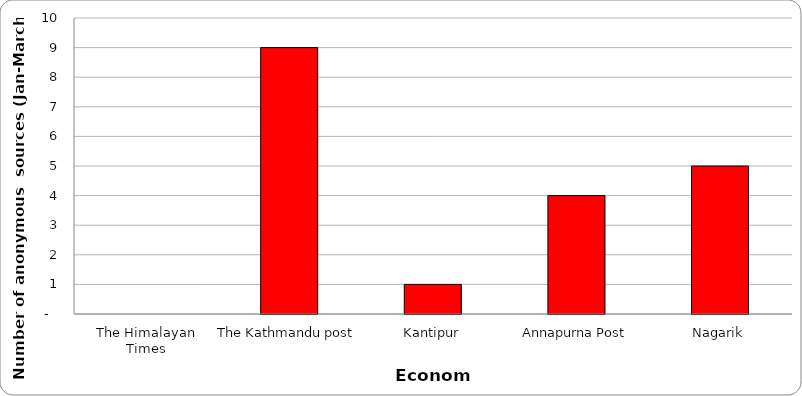
| Category | Economy |
|---|---|
| The Himalayan Times | 0 |
| The Kathmandu post | 9 |
| Kantipur | 1 |
| Annapurna Post | 4 |
| Nagarik | 5 |